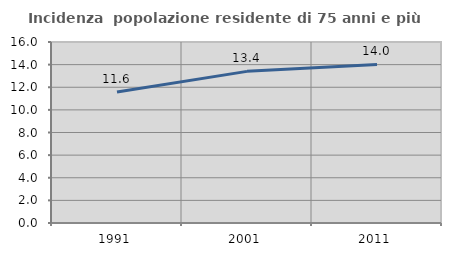
| Category | Incidenza  popolazione residente di 75 anni e più |
|---|---|
| 1991.0 | 11.577 |
| 2001.0 | 13.405 |
| 2011.0 | 14.015 |